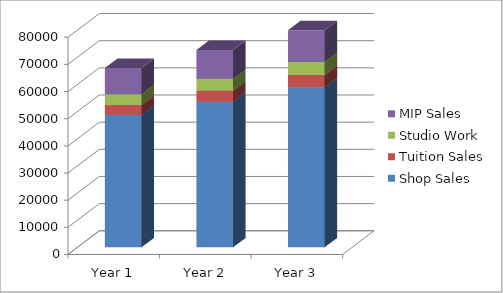
| Category | Shop Sales | Tuition Sales | Studio Work | MIP Sales |
|---|---|---|---|---|
| Year 1 | 48708 | 3696 | 4000 | 9636 |
| Year 2 | 53580 | 4068 | 4404 | 10596 |
| Year 3 | 58932 | 4524 | 4836 | 11652 |